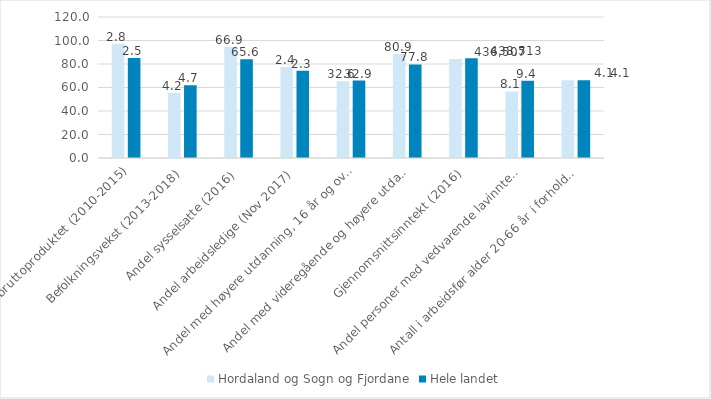
| Category | Hordaland og Sogn og Fjordane | Hele landet |
|---|---|---|
| Endring i bruttoproduktet (2010-2015) | 97.158 | 85.077 |
| Befolkningsvekst (2013-2018) | 55.263 | 61.842 |
| Andel sysselsatte (2016) | 94.444 | 84.127 |
| Andel arbeidsledige (Nov 2017) | 77.419 | 74.194 |
| Andel med høyere utdanning, 16 år og over (2016) | 65.331 | 65.932 |
| Andel med videregående og høyere utdanning, 25-29 år (2016) | 88.539 | 79.656 |
| Gjennomsnittsinntekt (2016) | 84.295 | 84.798 |
| Andel personer med vedvarende lavinntekt (2014-16) | 56.643 | 65.734 |
| Antall i arbeidsfør alder 20-66 år i forhold til eldre 67 år og over (2018) | 66.129 | 66.129 |